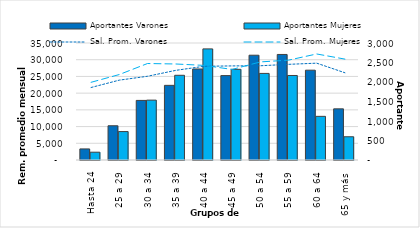
| Category | Aportantes Varones | Aportantes Mujeres |
|---|---|---|
| Hasta 24 | 284 | 200 |
| 25 a 29 | 878 | 729 |
| 30 a 34 | 1528 | 1535 |
| 35 a 39 | 1914 | 2172 |
| 40 a 44 | 2334 | 2849 |
| 45 a 49 | 2164 | 2325 |
| 50 a 54 | 2687 | 2220 |
| 55 a 59 | 2706 | 2167 |
| 60 a 64 | 2303 | 1119 |
| 65 y más | 1312 | 596 |